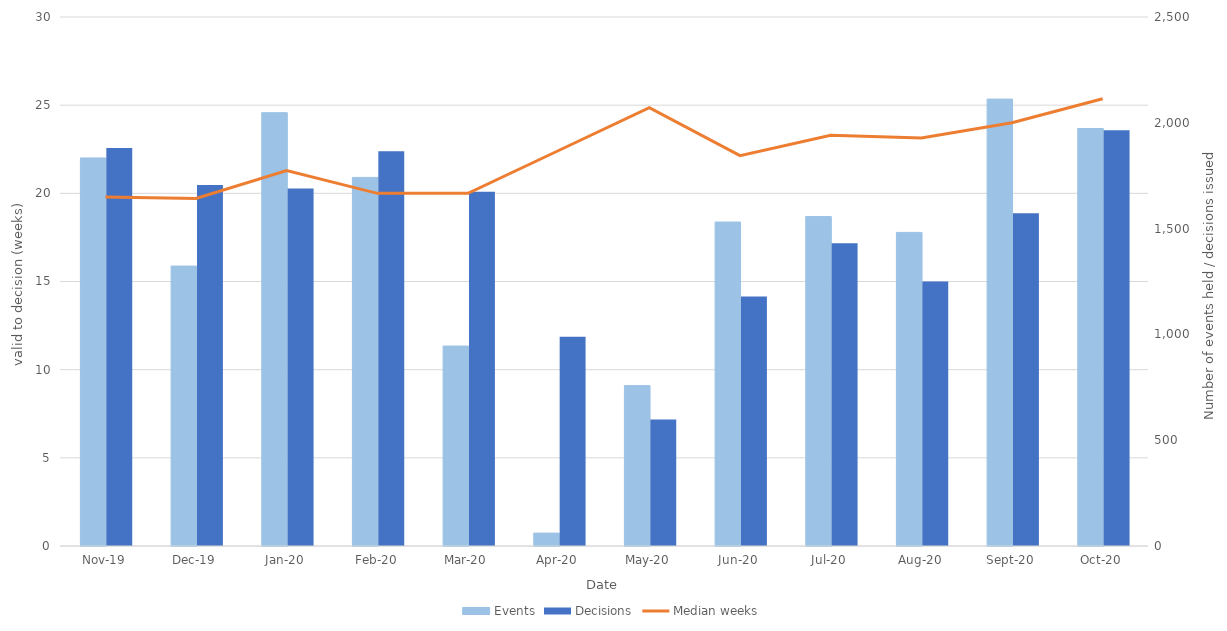
| Category | Events | Decisions |
|---|---|---|
| 0 | 1834 | 1881 |
| 1900-01-01 | 1323 | 1706 |
| 1900-01-02 | 2048 | 1690 |
| 1900-01-03 | 1742 | 1866 |
| 1900-01-04 | 945 | 1674 |
| 1900-01-05 | 61 | 989 |
| 1900-01-06 | 758 | 598 |
| 1900-01-07 | 1531 | 1179 |
| 1900-01-08 | 1557 | 1431 |
| 1900-01-09 | 1482 | 1250 |
| 1900-01-10 | 2112 | 1573 |
| 1900-01-11 | 1973 | 1965 |